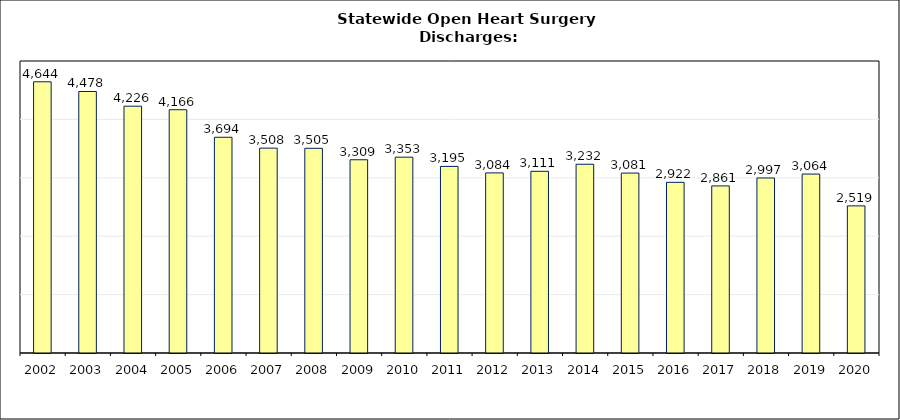
| Category | Series 1 |
|---|---|
| 2002.0 | 4644 |
| 2003.0 | 4478 |
| 2004.0 | 4226 |
| 2005.0 | 4166 |
| 2006.0 | 3694 |
| 2007.0 | 3508 |
| 2008.0 | 3505 |
| 2009.0 | 3309 |
| 2010.0 | 3353 |
| 2011.0 | 3195 |
| 2012.0 | 3084 |
| 2013.0 | 3111 |
| 2014.0 | 3232 |
| 2015.0 | 3081 |
| 2016.0 | 2922 |
| 2017.0 | 2861 |
| 2018.0 | 2997 |
| 2019.0 | 3064 |
| 2020.0 | 2519 |